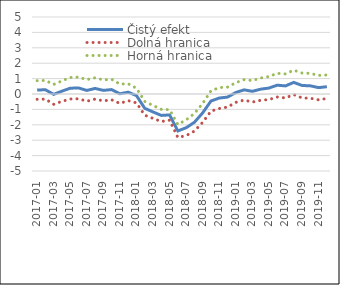
| Category | Čistý efekt | Dolná hranica | Horná hranica |
|---|---|---|---|
| 2017-01 | 0.259 | -0.345 | 0.864 |
| 2017-02 | 0.275 | -0.329 | 0.879 |
| 2017-03 | -0.024 | -0.669 | 0.622 |
| 2017-04 | 0.187 | -0.475 | 0.849 |
| 2017-05 | 0.376 | -0.323 | 1.075 |
| 2017-06 | 0.393 | -0.311 | 1.097 |
| 2017-07 | 0.232 | -0.469 | 0.934 |
| 2017-08 | 0.361 | -0.332 | 1.055 |
| 2017-09 | 0.236 | -0.445 | 0.917 |
| 2017-10 | 0.286 | -0.379 | 0.951 |
| 2017-11 | 0.018 | -0.611 | 0.646 |
| 2017-12 | 0.117 | -0.429 | 0.663 |
| 2018-01 | -0.103 | -0.577 | 0.371 |
| 2018-02 | -0.929 | -1.378 | -0.48 |
| 2018-03 | -1.165 | -1.585 | -0.746 |
| 2018-04 | -1.391 | -1.787 | -0.995 |
| 2018-05 | -1.36 | -1.698 | -1.021 |
| 2018-06 | -2.399 | -2.822 | -1.976 |
| 2018-07 | -2.191 | -2.701 | -1.68 |
| 2018-08 | -1.838 | -2.409 | -1.267 |
| 2018-09 | -1.223 | -1.838 | -0.608 |
| 2018-10 | -0.455 | -1.116 | 0.205 |
| 2018-11 | -0.262 | -0.941 | 0.416 |
| 2018-12 | -0.201 | -0.848 | 0.446 |
| 2019-01 | 0.096 | -0.544 | 0.735 |
| 2019-02 | 0.269 | -0.393 | 0.932 |
| 2019-03 | 0.174 | -0.525 | 0.873 |
| 2019-04 | 0.313 | -0.41 | 1.037 |
| 2019-05 | 0.387 | -0.361 | 1.134 |
| 2019-06 | 0.573 | -0.197 | 1.343 |
| 2019-07 | 0.525 | -0.255 | 1.305 |
| 2019-08 | 0.753 | -0.037 | 1.544 |
| 2019-09 | 0.553 | -0.255 | 1.362 |
| 2019-10 | 0.531 | -0.276 | 1.339 |
| 2019-11 | 0.413 | -0.38 | 1.206 |
| 2019-12 | 0.474 | -0.289 | 1.236 |